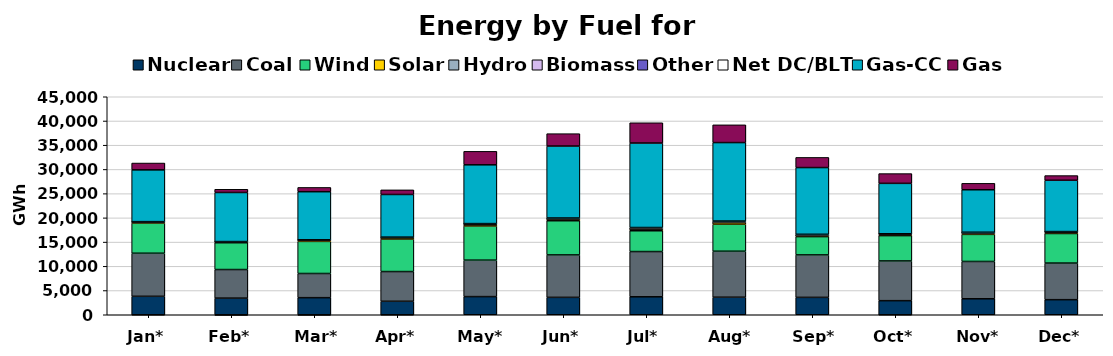
| Category | Nuclear | Coal | Wind | Solar | Hydro | Biomass | Other | Net DC/BLT | Gas-CC | Gas |
|---|---|---|---|---|---|---|---|---|---|---|
| Jan* | 3809 | 8891 | 6237 | 190 | 32 | 56 | 3 | -36 | 10690 | 1411 |
| Feb* | 3433 | 5899 | 5534 | 165 | 32 | 43 | 1 | -141 | 10134 | 661 |
| Mar* | 3528 | 4990 | 6625 | 241 | 53 | 38 | 2 | -115 | 9923 | 884 |
| Apr* | 2783 | 6132 | 6717 | 297 | 61 | 33 | 2 | -29 | 8801 | 951 |
| May* | 3746 | 7524 | 7060 | 340 | 60 | 66 | 3 | 18 | 12136 | 2779 |
| Jun* | 3593 | 8758 | 7059 | 368 | 49 | 63 | 2 | 80 | 14854 | 2558 |
| Jul* | 3706 | 9339 | 4293 | 367 | 44 | 67 | 4 | 189 | 17438 | 4183 |
| Aug* | 3622 | 9491 | 5569 | 354 | 55 | 58 | 1 | 191 | 16202 | 3661 |
| Sep* | 3589 | 8765 | 3778 | 257 | 38 | 31 | 2 | 150 | 13775 | 2096 |
| Oct* | 2909 | 8199 | 5227 | 209 | 139 | 32 | 3 | -1 | 10404 | 2014 |
| Nov* | 3297 | 7704 | 5592 | 250 | 132 | 32 | 3 | 24 | 8767 | 1326 |
| Dec* | 3111 | 7558 | 6105 | 203 | 113 | 42 | 2 | 35 | 10594 | 962 |